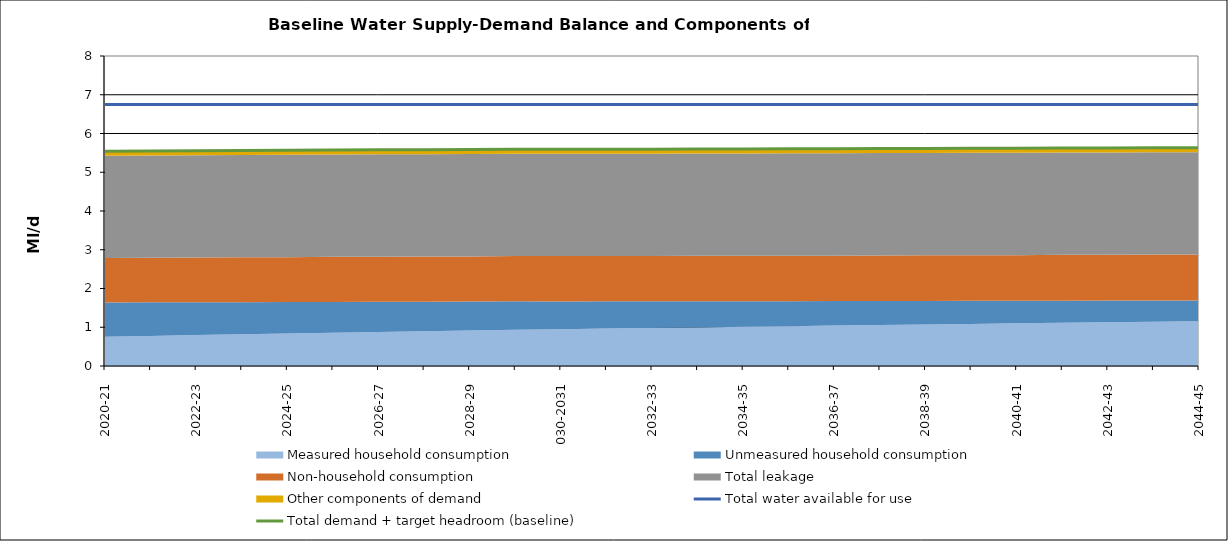
| Category | Total water available for use | Total demand + target headroom (baseline) |
|---|---|---|
| 0 | 6.75 | 5.542 |
| 1 | 6.75 | 5.551 |
| 2 | 6.75 | 5.557 |
| 3 | 6.75 | 5.564 |
| 4 | 6.75 | 5.566 |
| 5 | 6.75 | 5.574 |
| 6 | 6.75 | 5.579 |
| 7 | 6.75 | 5.583 |
| 8 | 6.75 | 5.585 |
| 9 | 6.75 | 5.593 |
| 10 | 6.75 | 5.594 |
| 11 | 6.75 | 5.596 |
| 12 | 6.75 | 5.595 |
| 13 | 6.75 | 5.6 |
| 14 | 6.75 | 5.601 |
| 15 | 6.75 | 5.605 |
| 16 | 6.75 | 5.605 |
| 17 | 6.75 | 5.611 |
| 18 | 6.75 | 5.614 |
| 19 | 6.75 | 5.618 |
| 20 | 6.75 | 5.618 |
| 21 | 6.75 | 5.625 |
| 22 | 6.75 | 5.629 |
| 23 | 6.75 | 5.632 |
| 24 | 6.75 | 5.633 |